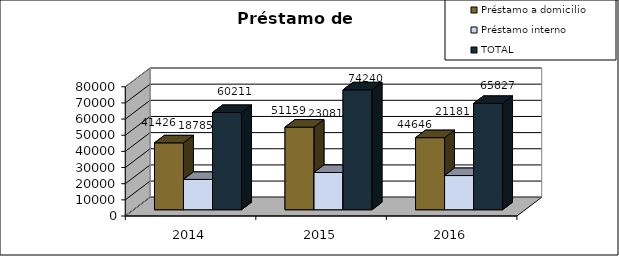
| Category | Préstamo a domicilio | Préstamo interno | TOTAL |
|---|---|---|---|
| 2014.0 | 41426 | 18785 | 60211 |
| 2015.0 | 51159 | 23081 | 74240 |
| 2016.0 | 44646 | 21181 | 65827 |